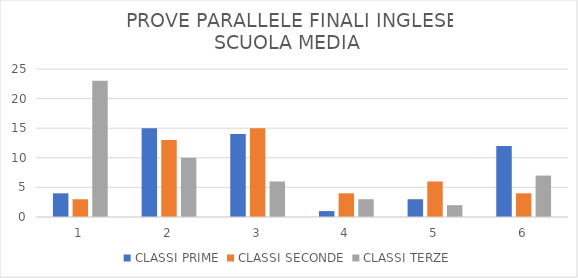
| Category | CLASSI PRIME | CLASSI SECONDE | CLASSI TERZE |
|---|---|---|---|
| 0 | 4 | 3 | 23 |
| 1 | 15 | 13 | 10 |
| 2 | 14 | 15 | 6 |
| 3 | 1 | 4 | 3 |
| 4 | 3 | 6 | 2 |
| 5 | 12 | 4 | 7 |